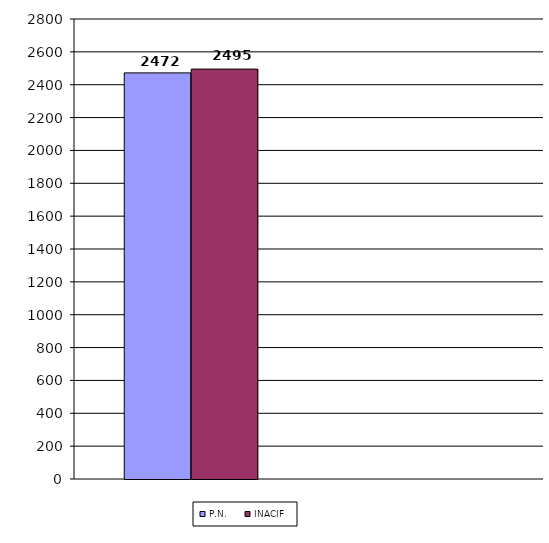
| Category | P.N. | INACIF |
|---|---|---|
| INACIF | 2472 | 2495 |